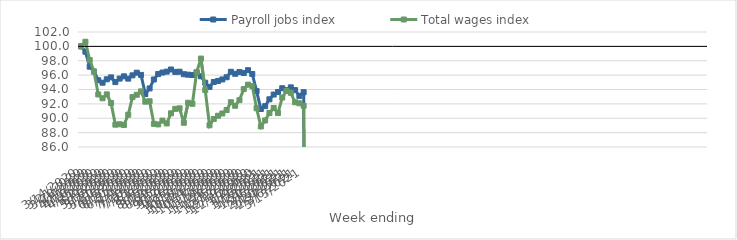
| Category | Payroll jobs index | Total wages index |
|---|---|---|
| 14/03/2020 | 100 | 100 |
| 21/03/2020 | 99.26 | 100.639 |
| 28/03/2020 | 97.174 | 98.092 |
| 04/04/2020 | 96.498 | 96.504 |
| 11/04/2020 | 95.286 | 93.312 |
| 18/04/2020 | 94.945 | 92.78 |
| 25/04/2020 | 95.421 | 93.326 |
| 02/05/2020 | 95.689 | 92.113 |
| 09/05/2020 | 95.033 | 89.108 |
| 16/05/2020 | 95.518 | 89.163 |
| 23/05/2020 | 95.831 | 89.069 |
| 30/05/2020 | 95.511 | 90.493 |
| 06/06/2020 | 95.969 | 92.947 |
| 13/06/2020 | 96.34 | 93.267 |
| 20/06/2020 | 96.03 | 93.74 |
| 27/06/2020 | 93.374 | 92.307 |
| 04/07/2020 | 94.15 | 92.363 |
| 11/07/2020 | 95.395 | 89.224 |
| 18/07/2020 | 96.147 | 89.138 |
| 25/07/2020 | 96.36 | 89.671 |
| 01/08/2020 | 96.487 | 89.276 |
| 08/08/2020 | 96.783 | 90.687 |
| 15/08/2020 | 96.448 | 91.309 |
| 22/08/2020 | 96.475 | 91.378 |
| 29/08/2020 | 96.126 | 89.373 |
| 05/09/2020 | 96.063 | 92.155 |
| 12/09/2020 | 96.012 | 92.012 |
| 19/09/2020 | 96.336 | 96.422 |
| 26/09/2020 | 95.837 | 98.304 |
| 03/10/2020 | 94.942 | 93.939 |
| 10/10/2020 | 94.362 | 89.021 |
| 17/10/2020 | 95.041 | 89.9 |
| 24/10/2020 | 95.192 | 90.348 |
| 31/10/2020 | 95.398 | 90.664 |
| 07/11/2020 | 95.703 | 91.144 |
| 14/11/2020 | 96.467 | 92.232 |
| 21/11/2020 | 96.185 | 91.736 |
| 28/11/2020 | 96.426 | 92.521 |
| 05/12/2020 | 96.288 | 94.057 |
| 12/12/2020 | 96.688 | 94.675 |
| 19/12/2020 | 96.156 | 94.47 |
| 26/12/2020 | 93.782 | 91.395 |
| 02/01/2021 | 91.286 | 88.86 |
| 09/01/2021 | 91.684 | 89.69 |
| 16/01/2021 | 92.639 | 90.728 |
| 23/01/2021 | 93.297 | 91.429 |
| 30/01/2021 | 93.658 | 90.728 |
| 06/02/2021 | 94.178 | 92.881 |
| 13/02/2021 | 93.913 | 93.793 |
| 20/02/2021 | 94.298 | 93.538 |
| 27/02/2021 | 93.914 | 92.225 |
| 06/03/2021 | 93.113 | 92.084 |
| 13/03/2021 | 93.626 | 91.739 |